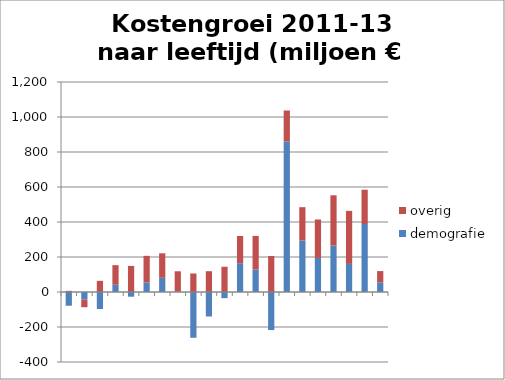
| Category | demografie | overig |
|---|---|---|
|  | -78.544 | 6.626 |
|  | -43.262 | -43.749 |
|  | -97.281 | 63.896 |
|  | 41.589 | 111.75 |
|  | -26.824 | 149.035 |
|  | 54.621 | 151.971 |
|  | 81.225 | 139.881 |
|  | 3.766 | 114.713 |
|  | -261.553 | 105.839 |
|  | -140.011 | 118.889 |
|  | -35.111 | 144.392 |
|  | 164.632 | 155.464 |
|  | 128.792 | 191.723 |
|  | -217.518 | 205.57 |
|  | 859.962 | 177.142 |
|  | 293.75 | 191.015 |
|  | 194.725 | 219.605 |
|  | 265.402 | 287.15 |
|  | 160.551 | 302.966 |
|  | 388.489 | 195.96 |
|  | 55.07 | 64.483 |